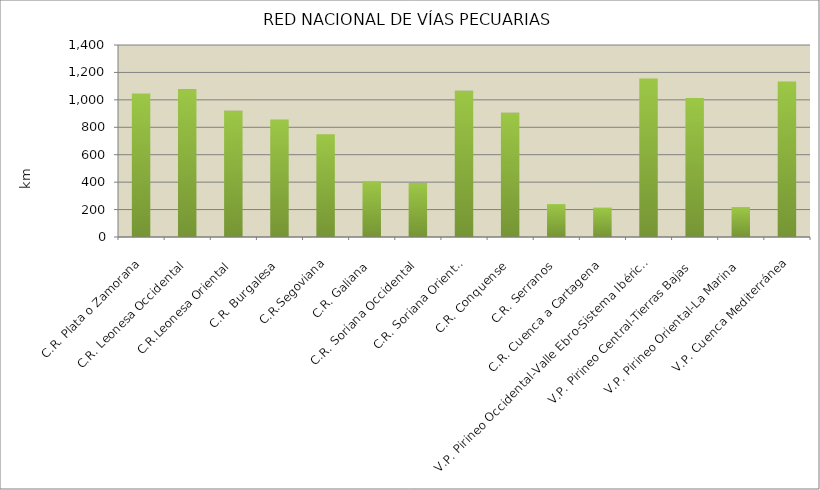
| Category | RED NACIONAL DE VÍAS PECUARIAS |
|---|---|
| C.R. Plata o Zamorana | 1044 |
| C.R. Leonesa Occidental | 1080 |
| C.R.Leonesa Oriental | 920 |
| C.R. Burgalesa | 857 |
| C.R.Segoviana | 749 |
| C.R. Galiana | 407 |
| C.R. Soriana Occidental | 394 |
| C.R. Soriana Oriental | 1066 |
| C.R. Conquense | 906 |
| C.R. Serranos | 240 |
| C.R. Cuenca a Cartagena | 213 |
| V.P. Pirineo Occidental-Valle Ebro-Sistema Ibérico Occidental | 1156 |
| V.P. Pirineo Central-Tierras Bajas | 1013 |
| V.P. Pirineo Oriental-La Marina | 215 |
| V.P. Cuenca Mediterránea | 1134 |